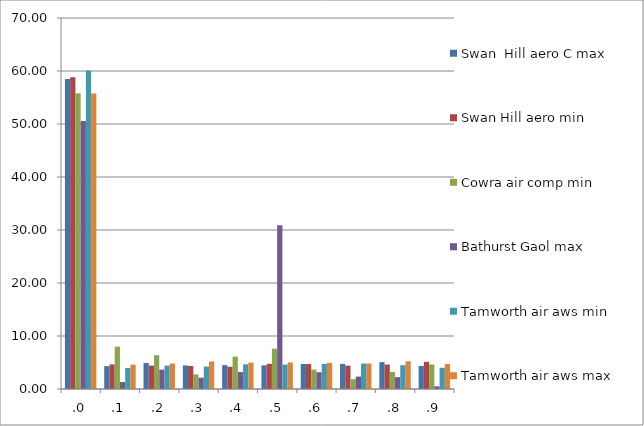
| Category | Swan  Hill aero C max | Swan Hill aero min | Cowra air comp min | Bathurst Gaol max | Tamworth air aws min | Tamworth air aws max |
|---|---|---|---|---|---|---|
| .0 | 58.499 | 58.799 | 55.794 | 50.585 | 60.072 | 55.761 |
| .1 | 4.314 | 4.643 | 7.983 | 1.304 | 3.976 | 4.595 |
| .2 | 4.904 | 4.404 | 6.379 | 3.646 | 4.414 | 4.807 |
| .3 | 4.443 | 4.349 | 2.76 | 2.129 | 4.242 | 5.189 |
| .4 | 4.499 | 4.201 | 6.109 | 3.193 | 4.649 | 4.963 |
| .5 | 4.462 | 4.754 | 7.6 | 30.894 | 4.602 | 5.019 |
| .6 | 4.72 | 4.699 | 3.668 | 3.167 | 4.743 | 4.92 |
| .7 | 4.738 | 4.404 | 1.845 | 2.342 | 4.805 | 4.807 |
| .8 | 5.07 | 4.625 | 3.236 | 2.235 | 4.492 | 5.231 |
| .9 | 4.351 | 5.123 | 4.626 | 0.506 | 4.007 | 4.708 |